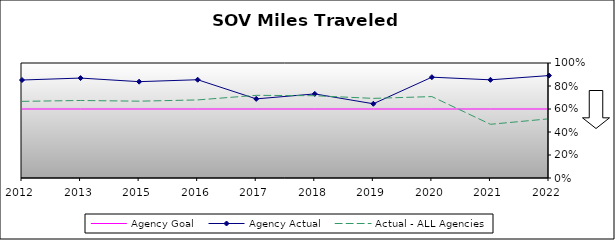
| Category | Agency Goal | Agency Actual | Actual - ALL Agencies |
|---|---|---|---|
| 2012.0 | 0.6 | 0.852 | 0.666 |
| 2013.0 | 0.6 | 0.869 | 0.674 |
| 2015.0 | 0.6 | 0.838 | 0.668 |
| 2016.0 | 0.6 | 0.855 | 0.679 |
| 2017.0 | 0.6 | 0.688 | 0.719 |
| 2018.0 | 0.6 | 0.731 | 0.715 |
| 2019.0 | 0.6 | 0.645 | 0.692 |
| 2020.0 | 0.6 | 0.877 | 0.708 |
| 2021.0 | 0.6 | 0.854 | 0.467 |
| 2022.0 | 0.6 | 0.891 | 0.515 |